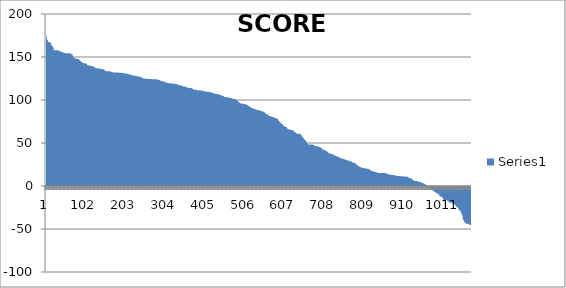
| Category | Series 0 |
|---|---|
| 0 | 175.5 |
| 1 | 175.4 |
| 2 | 170.6 |
| 3 | 170 |
| 4 | 169.9 |
| 5 | 167.9 |
| 6 | 167.7 |
| 7 | 167.4 |
| 8 | 167.2 |
| 9 | 167.2 |
| 10 | 167 |
| 11 | 166.6 |
| 12 | 166.4 |
| 13 | 166.1 |
| 14 | 164 |
| 15 | 162.6 |
| 16 | 162.6 |
| 17 | 162.5 |
| 18 | 162.1 |
| 19 | 160.8 |
| 20 | 157.8 |
| 21 | 157.8 |
| 22 | 157.8 |
| 23 | 157.8 |
| 24 | 157.8 |
| 25 | 157.8 |
| 26 | 157.8 |
| 27 | 157.8 |
| 28 | 157.8 |
| 29 | 157.8 |
| 30 | 157.8 |
| 31 | 157.8 |
| 32 | 157.8 |
| 33 | 157.7 |
| 34 | 156.8 |
| 35 | 156.8 |
| 36 | 156.8 |
| 37 | 156.6 |
| 38 | 155.9 |
| 39 | 155.9 |
| 40 | 155.9 |
| 41 | 155.7 |
| 42 | 155.7 |
| 43 | 155.3 |
| 44 | 155.1 |
| 45 | 154.8 |
| 46 | 154.6 |
| 47 | 154.6 |
| 48 | 154.6 |
| 49 | 154.4 |
| 50 | 154.4 |
| 51 | 154.4 |
| 52 | 154.3 |
| 53 | 154.3 |
| 54 | 154.3 |
| 55 | 154.3 |
| 56 | 154.3 |
| 57 | 154.3 |
| 58 | 154.3 |
| 59 | 154.3 |
| 60 | 154.3 |
| 61 | 154 |
| 62 | 154 |
| 63 | 153.8 |
| 64 | 153.3 |
| 65 | 153.3 |
| 66 | 153.1 |
| 67 | 152.8 |
| 68 | 151 |
| 69 | 150.4 |
| 70 | 149.1 |
| 71 | 149.1 |
| 72 | 149 |
| 73 | 148.7 |
| 74 | 148.4 |
| 75 | 148.4 |
| 76 | 148.3 |
| 77 | 147.9 |
| 78 | 147.8 |
| 79 | 147.8 |
| 80 | 147.8 |
| 81 | 147.7 |
| 82 | 147.7 |
| 83 | 147.5 |
| 84 | 147.1 |
| 85 | 145.8 |
| 86 | 145.8 |
| 87 | 145.8 |
| 88 | 144.9 |
| 89 | 144.6 |
| 90 | 144.6 |
| 91 | 144.1 |
| 92 | 143.9 |
| 93 | 143 |
| 94 | 142.7 |
| 95 | 142.7 |
| 96 | 142.7 |
| 97 | 142.7 |
| 98 | 142.7 |
| 99 | 142.7 |
| 100 | 142.6 |
| 101 | 142.5 |
| 102 | 142.4 |
| 103 | 142.1 |
| 104 | 141.8 |
| 105 | 140.4 |
| 106 | 140.2 |
| 107 | 140 |
| 108 | 140 |
| 109 | 140 |
| 110 | 140 |
| 111 | 140 |
| 112 | 140 |
| 113 | 139.9 |
| 114 | 139.6 |
| 115 | 139.4 |
| 116 | 139.4 |
| 117 | 139.4 |
| 118 | 139.3 |
| 119 | 139 |
| 120 | 138.9 |
| 121 | 138.6 |
| 122 | 138.6 |
| 123 | 138.2 |
| 124 | 137.8 |
| 125 | 137.6 |
| 126 | 136.8 |
| 127 | 136.8 |
| 128 | 136.8 |
| 129 | 136.8 |
| 130 | 136.8 |
| 131 | 136.8 |
| 132 | 136.8 |
| 133 | 136.8 |
| 134 | 136.7 |
| 135 | 136.7 |
| 136 | 136.7 |
| 137 | 136.5 |
| 138 | 136.2 |
| 139 | 136.2 |
| 140 | 136.1 |
| 141 | 136.1 |
| 142 | 135.9 |
| 143 | 135.9 |
| 144 | 135.9 |
| 145 | 135.9 |
| 146 | 135.6 |
| 147 | 135.5 |
| 148 | 134.9 |
| 149 | 134.3 |
| 150 | 133.6 |
| 151 | 133.6 |
| 152 | 133.6 |
| 153 | 133.6 |
| 154 | 133.5 |
| 155 | 133.5 |
| 156 | 133.5 |
| 157 | 133.5 |
| 158 | 133.5 |
| 159 | 133.5 |
| 160 | 133.5 |
| 161 | 133.3 |
| 162 | 133.3 |
| 163 | 133.1 |
| 164 | 132.8 |
| 165 | 132.7 |
| 166 | 132.6 |
| 167 | 132.3 |
| 168 | 132.3 |
| 169 | 132.2 |
| 170 | 132.2 |
| 171 | 132.1 |
| 172 | 132.1 |
| 173 | 132.1 |
| 174 | 132.1 |
| 175 | 132.1 |
| 176 | 132.1 |
| 177 | 132.1 |
| 178 | 132.1 |
| 179 | 132.1 |
| 180 | 132.1 |
| 181 | 132.1 |
| 182 | 132.1 |
| 183 | 132.1 |
| 184 | 131.8 |
| 185 | 131.6 |
| 186 | 131.6 |
| 187 | 131.6 |
| 188 | 131.6 |
| 189 | 131.6 |
| 190 | 131.6 |
| 191 | 131.6 |
| 192 | 131.6 |
| 193 | 131.5 |
| 194 | 131.5 |
| 195 | 131.5 |
| 196 | 131.4 |
| 197 | 131.1 |
| 198 | 131.1 |
| 199 | 131 |
| 200 | 130.9 |
| 201 | 130.8 |
| 202 | 130.8 |
| 203 | 130.8 |
| 204 | 130.8 |
| 205 | 130.5 |
| 206 | 130.5 |
| 207 | 130.3 |
| 208 | 130 |
| 209 | 130 |
| 210 | 130 |
| 211 | 130 |
| 212 | 129.8 |
| 213 | 129.8 |
| 214 | 129.2 |
| 215 | 129.1 |
| 216 | 129.1 |
| 217 | 129 |
| 218 | 128.8 |
| 219 | 128.8 |
| 220 | 128.5 |
| 221 | 128.5 |
| 222 | 128.4 |
| 223 | 128.3 |
| 224 | 128.3 |
| 225 | 128.3 |
| 226 | 128.3 |
| 227 | 127.8 |
| 228 | 127.8 |
| 229 | 127.8 |
| 230 | 127.5 |
| 231 | 127.5 |
| 232 | 127.4 |
| 233 | 127.2 |
| 234 | 127.2 |
| 235 | 127.2 |
| 236 | 127.2 |
| 237 | 127 |
| 238 | 126.8 |
| 239 | 126.7 |
| 240 | 126.7 |
| 241 | 126.4 |
| 242 | 126.1 |
| 243 | 126 |
| 244 | 125.5 |
| 245 | 125.4 |
| 246 | 125.2 |
| 247 | 125.1 |
| 248 | 125.1 |
| 249 | 125 |
| 250 | 124.9 |
| 251 | 124.8 |
| 252 | 124.8 |
| 253 | 124.8 |
| 254 | 124.8 |
| 255 | 124.7 |
| 256 | 124.7 |
| 257 | 124.6 |
| 258 | 124.4 |
| 259 | 124.4 |
| 260 | 124.4 |
| 261 | 124.4 |
| 262 | 124.4 |
| 263 | 124.4 |
| 264 | 124.3 |
| 265 | 124.3 |
| 266 | 124.3 |
| 267 | 124.2 |
| 268 | 124.1 |
| 269 | 124.1 |
| 270 | 124.1 |
| 271 | 124.1 |
| 272 | 124.1 |
| 273 | 124.1 |
| 274 | 124.1 |
| 275 | 124.1 |
| 276 | 124.1 |
| 277 | 124.1 |
| 278 | 124.1 |
| 279 | 124.1 |
| 280 | 124.1 |
| 281 | 124.1 |
| 282 | 123.9 |
| 283 | 123.7 |
| 284 | 123.5 |
| 285 | 123.5 |
| 286 | 123.4 |
| 287 | 123.2 |
| 288 | 123.1 |
| 289 | 122.7 |
| 290 | 122.4 |
| 291 | 122.1 |
| 292 | 122 |
| 293 | 121.9 |
| 294 | 121.9 |
| 295 | 121.9 |
| 296 | 121.6 |
| 297 | 121.4 |
| 298 | 121.4 |
| 299 | 121.4 |
| 300 | 121.3 |
| 301 | 121.2 |
| 302 | 120.6 |
| 303 | 120.6 |
| 304 | 120.4 |
| 305 | 120.3 |
| 306 | 120 |
| 307 | 119.9 |
| 308 | 119.8 |
| 309 | 119.7 |
| 310 | 119.6 |
| 311 | 119.6 |
| 312 | 119.5 |
| 313 | 119.3 |
| 314 | 119.3 |
| 315 | 119.3 |
| 316 | 119.3 |
| 317 | 119.3 |
| 318 | 119.2 |
| 319 | 119.1 |
| 320 | 119.1 |
| 321 | 119.1 |
| 322 | 119 |
| 323 | 118.9 |
| 324 | 118.8 |
| 325 | 118.8 |
| 326 | 118.7 |
| 327 | 118.5 |
| 328 | 118.5 |
| 329 | 118.5 |
| 330 | 118.5 |
| 331 | 118.4 |
| 332 | 118.4 |
| 333 | 117.9 |
| 334 | 117.9 |
| 335 | 117.7 |
| 336 | 117.5 |
| 337 | 117.1 |
| 338 | 117.1 |
| 339 | 117 |
| 340 | 117 |
| 341 | 116.9 |
| 342 | 116.9 |
| 343 | 116.7 |
| 344 | 116.7 |
| 345 | 116.2 |
| 346 | 116 |
| 347 | 115.8 |
| 348 | 115.8 |
| 349 | 115.6 |
| 350 | 115.6 |
| 351 | 115.6 |
| 352 | 115.5 |
| 353 | 115.4 |
| 354 | 115.4 |
| 355 | 114.9 |
| 356 | 114.8 |
| 357 | 114.6 |
| 358 | 114.3 |
| 359 | 114.2 |
| 360 | 114.2 |
| 361 | 114.1 |
| 362 | 114 |
| 363 | 113.9 |
| 364 | 113.9 |
| 365 | 113.9 |
| 366 | 113.9 |
| 367 | 113.9 |
| 368 | 113.7 |
| 369 | 113.5 |
| 370 | 113.4 |
| 371 | 113.1 |
| 372 | 112.6 |
| 373 | 112.2 |
| 374 | 112.2 |
| 375 | 112.1 |
| 376 | 112.1 |
| 377 | 112 |
| 378 | 111.9 |
| 379 | 111.9 |
| 380 | 111.8 |
| 381 | 111.8 |
| 382 | 111.4 |
| 383 | 111.4 |
| 384 | 111.4 |
| 385 | 111.4 |
| 386 | 111.4 |
| 387 | 111.3 |
| 388 | 111.2 |
| 389 | 111.2 |
| 390 | 111.2 |
| 391 | 111.1 |
| 392 | 111.1 |
| 393 | 111.1 |
| 394 | 111 |
| 395 | 110.9 |
| 396 | 110.7 |
| 397 | 110.7 |
| 398 | 110.4 |
| 399 | 110.3 |
| 400 | 110.3 |
| 401 | 110.3 |
| 402 | 110.2 |
| 403 | 110.2 |
| 404 | 110.1 |
| 405 | 109.9 |
| 406 | 109.7 |
| 407 | 109.7 |
| 408 | 109.7 |
| 409 | 109.5 |
| 410 | 109.4 |
| 411 | 109.3 |
| 412 | 109.2 |
| 413 | 109.2 |
| 414 | 109.2 |
| 415 | 109.1 |
| 416 | 109.1 |
| 417 | 109 |
| 418 | 108.8 |
| 419 | 108.6 |
| 420 | 108.6 |
| 421 | 108.3 |
| 422 | 108.2 |
| 423 | 108 |
| 424 | 107.9 |
| 425 | 107.8 |
| 426 | 107.8 |
| 427 | 107.6 |
| 428 | 107 |
| 429 | 107 |
| 430 | 107 |
| 431 | 107 |
| 432 | 107 |
| 433 | 107 |
| 434 | 106.8 |
| 435 | 106.7 |
| 436 | 106.6 |
| 437 | 106.4 |
| 438 | 106.4 |
| 439 | 106.2 |
| 440 | 106.1 |
| 441 | 105.8 |
| 442 | 105.6 |
| 443 | 105.6 |
| 444 | 105.5 |
| 445 | 105.4 |
| 446 | 105.4 |
| 447 | 104.8 |
| 448 | 104.5 |
| 449 | 104.4 |
| 450 | 104.4 |
| 451 | 104.1 |
| 452 | 103.5 |
| 453 | 103.3 |
| 454 | 103.3 |
| 455 | 103.3 |
| 456 | 103.3 |
| 457 | 103.3 |
| 458 | 103.2 |
| 459 | 103.1 |
| 460 | 103.1 |
| 461 | 103.1 |
| 462 | 102.8 |
| 463 | 102.6 |
| 464 | 102.6 |
| 465 | 102.6 |
| 466 | 102.5 |
| 467 | 102.5 |
| 468 | 102.2 |
| 469 | 102.2 |
| 470 | 101.9 |
| 471 | 101.9 |
| 472 | 101.5 |
| 473 | 101.3 |
| 474 | 101.3 |
| 475 | 101.2 |
| 476 | 101.1 |
| 477 | 101.1 |
| 478 | 100.9 |
| 479 | 100.9 |
| 480 | 100.8 |
| 481 | 100.4 |
| 482 | 99.7 |
| 483 | 99.6 |
| 484 | 99.4 |
| 485 | 99.2 |
| 486 | 98.6 |
| 487 | 97.5 |
| 488 | 97.5 |
| 489 | 97.3 |
| 490 | 96.7 |
| 491 | 96.3 |
| 492 | 96.2 |
| 493 | 95.9 |
| 494 | 95.9 |
| 495 | 95.9 |
| 496 | 95.9 |
| 497 | 95.8 |
| 498 | 95.5 |
| 499 | 95.5 |
| 500 | 95.3 |
| 501 | 95.3 |
| 502 | 95.3 |
| 503 | 95.2 |
| 504 | 95.1 |
| 505 | 95.1 |
| 506 | 94.8 |
| 507 | 94.7 |
| 508 | 94.4 |
| 509 | 94.1 |
| 510 | 94.1 |
| 511 | 93.7 |
| 512 | 93.4 |
| 513 | 92.6 |
| 514 | 92.6 |
| 515 | 92.6 |
| 516 | 92.6 |
| 517 | 92 |
| 518 | 91.9 |
| 519 | 91.1 |
| 520 | 90.7 |
| 521 | 90.6 |
| 522 | 90.5 |
| 523 | 90.4 |
| 524 | 89.9 |
| 525 | 89.8 |
| 526 | 89.5 |
| 527 | 89.5 |
| 528 | 89.5 |
| 529 | 89.5 |
| 530 | 89.3 |
| 531 | 89 |
| 532 | 88.7 |
| 533 | 88.6 |
| 534 | 88.3 |
| 535 | 88.3 |
| 536 | 88.3 |
| 537 | 88.1 |
| 538 | 88 |
| 539 | 88 |
| 540 | 88 |
| 541 | 87.7 |
| 542 | 87.6 |
| 543 | 87.5 |
| 544 | 87.3 |
| 545 | 87 |
| 546 | 87 |
| 547 | 86.9 |
| 548 | 86.8 |
| 549 | 86.6 |
| 550 | 86.6 |
| 551 | 86.3 |
| 552 | 85.9 |
| 553 | 85.6 |
| 554 | 85.4 |
| 555 | 84.5 |
| 556 | 84.3 |
| 557 | 83.8 |
| 558 | 83.5 |
| 559 | 83.4 |
| 560 | 83.2 |
| 561 | 83.2 |
| 562 | 83.1 |
| 563 | 82.6 |
| 564 | 81.7 |
| 565 | 81.3 |
| 566 | 81.3 |
| 567 | 81.2 |
| 568 | 81.1 |
| 569 | 81.1 |
| 570 | 81 |
| 571 | 80.5 |
| 572 | 80.5 |
| 573 | 80.4 |
| 574 | 80.2 |
| 575 | 80.2 |
| 576 | 80.2 |
| 577 | 79.5 |
| 578 | 79.5 |
| 579 | 79.2 |
| 580 | 79.1 |
| 581 | 79.1 |
| 582 | 78.8 |
| 583 | 78.7 |
| 584 | 78.7 |
| 585 | 78.6 |
| 586 | 78.3 |
| 587 | 77.8 |
| 588 | 76 |
| 589 | 75.6 |
| 590 | 75.1 |
| 591 | 74.9 |
| 592 | 74.5 |
| 593 | 74.2 |
| 594 | 74 |
| 595 | 72.5 |
| 596 | 72.5 |
| 597 | 72.3 |
| 598 | 72.3 |
| 599 | 72 |
| 600 | 70.5 |
| 601 | 70.1 |
| 602 | 70.1 |
| 603 | 69.6 |
| 604 | 69.6 |
| 605 | 68.8 |
| 606 | 68.8 |
| 607 | 68.8 |
| 608 | 68.6 |
| 609 | 68.5 |
| 610 | 67.5 |
| 611 | 66.8 |
| 612 | 66.2 |
| 613 | 66 |
| 614 | 65.9 |
| 615 | 65.8 |
| 616 | 65.8 |
| 617 | 65.6 |
| 618 | 65.6 |
| 619 | 65.1 |
| 620 | 65.1 |
| 621 | 65.1 |
| 622 | 65.1 |
| 623 | 65.1 |
| 624 | 64.9 |
| 625 | 64.9 |
| 626 | 64.2 |
| 627 | 63.3 |
| 628 | 63.2 |
| 629 | 63 |
| 630 | 62.6 |
| 631 | 62.6 |
| 632 | 61.9 |
| 633 | 61.5 |
| 634 | 60.9 |
| 635 | 60.9 |
| 636 | 60.8 |
| 637 | 60.8 |
| 638 | 60.8 |
| 639 | 60.8 |
| 640 | 60.8 |
| 641 | 60.8 |
| 642 | 60.8 |
| 643 | 60.7 |
| 644 | 60.1 |
| 645 | 59.7 |
| 646 | 59.2 |
| 647 | 59.1 |
| 648 | 57.6 |
| 649 | 57.1 |
| 650 | 56.7 |
| 651 | 56.2 |
| 652 | 55.3 |
| 653 | 55 |
| 654 | 53.7 |
| 655 | 53.7 |
| 656 | 53.6 |
| 657 | 52.7 |
| 658 | 51.9 |
| 659 | 51.9 |
| 660 | 50.8 |
| 661 | 49.8 |
| 662 | 49.3 |
| 663 | 48.8 |
| 664 | 48.3 |
| 665 | 48.3 |
| 666 | 48.3 |
| 667 | 48.3 |
| 668 | 48.3 |
| 669 | 48.3 |
| 670 | 48.3 |
| 671 | 48.3 |
| 672 | 48.3 |
| 673 | 48.3 |
| 674 | 48.3 |
| 675 | 48.3 |
| 676 | 47.9 |
| 677 | 47.7 |
| 678 | 47.6 |
| 679 | 47.3 |
| 680 | 46.6 |
| 681 | 46.5 |
| 682 | 46.5 |
| 683 | 46.3 |
| 684 | 46.3 |
| 685 | 46.2 |
| 686 | 46.2 |
| 687 | 46.1 |
| 688 | 45.7 |
| 689 | 45.7 |
| 690 | 45.7 |
| 691 | 45.5 |
| 692 | 45.5 |
| 693 | 45.2 |
| 694 | 44.7 |
| 695 | 44.6 |
| 696 | 44.5 |
| 697 | 44.4 |
| 698 | 44.4 |
| 699 | 42.7 |
| 700 | 42.3 |
| 701 | 42.3 |
| 702 | 42.1 |
| 703 | 42.1 |
| 704 | 41.8 |
| 705 | 41.7 |
| 706 | 41.6 |
| 707 | 41.5 |
| 708 | 41 |
| 709 | 40.5 |
| 710 | 40.4 |
| 711 | 40.1 |
| 712 | 39.8 |
| 713 | 39.5 |
| 714 | 39.3 |
| 715 | 38.3 |
| 716 | 38.2 |
| 717 | 38.1 |
| 718 | 37.8 |
| 719 | 37.8 |
| 720 | 37.5 |
| 721 | 37.3 |
| 722 | 37.3 |
| 723 | 37.2 |
| 724 | 36.9 |
| 725 | 36.9 |
| 726 | 36.8 |
| 727 | 36.4 |
| 728 | 36.4 |
| 729 | 36.2 |
| 730 | 35.8 |
| 731 | 35.3 |
| 732 | 35.3 |
| 733 | 35.3 |
| 734 | 34.8 |
| 735 | 34.7 |
| 736 | 34.3 |
| 737 | 34.3 |
| 738 | 34.2 |
| 739 | 34.1 |
| 740 | 34.1 |
| 741 | 33.8 |
| 742 | 33.7 |
| 743 | 32.8 |
| 744 | 32.8 |
| 745 | 32.7 |
| 746 | 32.2 |
| 747 | 32.2 |
| 748 | 31.7 |
| 749 | 31.6 |
| 750 | 31.6 |
| 751 | 31.6 |
| 752 | 31.6 |
| 753 | 31.6 |
| 754 | 31.5 |
| 755 | 31 |
| 756 | 31 |
| 757 | 30.7 |
| 758 | 30.7 |
| 759 | 30.5 |
| 760 | 30.2 |
| 761 | 30.2 |
| 762 | 30 |
| 763 | 29.7 |
| 764 | 29.7 |
| 765 | 29.6 |
| 766 | 29.4 |
| 767 | 29.1 |
| 768 | 29.1 |
| 769 | 29.1 |
| 770 | 29.1 |
| 771 | 28.5 |
| 772 | 28.5 |
| 773 | 28.4 |
| 774 | 28.2 |
| 775 | 27.3 |
| 776 | 27.3 |
| 777 | 27.3 |
| 778 | 27 |
| 779 | 26.9 |
| 780 | 26.9 |
| 781 | 26.8 |
| 782 | 26.8 |
| 783 | 26 |
| 784 | 25.9 |
| 785 | 25.4 |
| 786 | 24.9 |
| 787 | 24.3 |
| 788 | 24.3 |
| 789 | 23.8 |
| 790 | 23 |
| 791 | 23 |
| 792 | 22.8 |
| 793 | 22.8 |
| 794 | 22.5 |
| 795 | 22.1 |
| 796 | 22 |
| 797 | 21.6 |
| 798 | 21.3 |
| 799 | 21.3 |
| 800 | 21.2 |
| 801 | 21.1 |
| 802 | 21 |
| 803 | 21 |
| 804 | 20.8 |
| 805 | 20.7 |
| 806 | 20.6 |
| 807 | 20.5 |
| 808 | 20.4 |
| 809 | 20.3 |
| 810 | 20.3 |
| 811 | 20.3 |
| 812 | 20.3 |
| 813 | 20.2 |
| 814 | 20.2 |
| 815 | 20.2 |
| 816 | 20.2 |
| 817 | 19.7 |
| 818 | 19.7 |
| 819 | 18.8 |
| 820 | 18.3 |
| 821 | 18.3 |
| 822 | 18 |
| 823 | 17.9 |
| 824 | 17.6 |
| 825 | 17.2 |
| 826 | 17.2 |
| 827 | 17.2 |
| 828 | 17.1 |
| 829 | 17.1 |
| 830 | 16.9 |
| 831 | 16.5 |
| 832 | 16.4 |
| 833 | 16.4 |
| 834 | 16.2 |
| 835 | 16.1 |
| 836 | 16.1 |
| 837 | 16 |
| 838 | 15.8 |
| 839 | 15.4 |
| 840 | 15.3 |
| 841 | 15.2 |
| 842 | 15.2 |
| 843 | 15.2 |
| 844 | 15.2 |
| 845 | 15.2 |
| 846 | 15.2 |
| 847 | 15.2 |
| 848 | 15.2 |
| 849 | 15.2 |
| 850 | 15.2 |
| 851 | 15.2 |
| 852 | 15.2 |
| 853 | 15.2 |
| 854 | 15.2 |
| 855 | 15.2 |
| 856 | 15.2 |
| 857 | 15.2 |
| 858 | 15.2 |
| 859 | 15.2 |
| 860 | 14.9 |
| 861 | 14.9 |
| 862 | 14.6 |
| 863 | 14.6 |
| 864 | 14.6 |
| 865 | 13.8 |
| 866 | 13.5 |
| 867 | 13.5 |
| 868 | 13.4 |
| 869 | 13.3 |
| 870 | 13.3 |
| 871 | 13.3 |
| 872 | 13.2 |
| 873 | 13 |
| 874 | 12.9 |
| 875 | 12.9 |
| 876 | 12.9 |
| 877 | 12.9 |
| 878 | 12.9 |
| 879 | 12.9 |
| 880 | 12.7 |
| 881 | 12.7 |
| 882 | 12.7 |
| 883 | 12.3 |
| 884 | 12.3 |
| 885 | 12.2 |
| 886 | 12 |
| 887 | 11.6 |
| 888 | 11.5 |
| 889 | 11.5 |
| 890 | 11.5 |
| 891 | 11.5 |
| 892 | 11.5 |
| 893 | 11.5 |
| 894 | 11.5 |
| 895 | 11.5 |
| 896 | 11.5 |
| 897 | 11.4 |
| 898 | 11.3 |
| 899 | 11.3 |
| 900 | 11.3 |
| 901 | 11.3 |
| 902 | 11.3 |
| 903 | 11.3 |
| 904 | 11.2 |
| 905 | 11.1 |
| 906 | 11 |
| 907 | 11 |
| 908 | 11 |
| 909 | 11 |
| 910 | 11 |
| 911 | 11 |
| 912 | 10.9 |
| 913 | 10.9 |
| 914 | 10.8 |
| 915 | 10.8 |
| 916 | 10.5 |
| 917 | 10.1 |
| 918 | 9.5 |
| 919 | 9.2 |
| 920 | 9 |
| 921 | 8.9 |
| 922 | 8.9 |
| 923 | 8.9 |
| 924 | 8.9 |
| 925 | 8.5 |
| 926 | 8.1 |
| 927 | 7.6 |
| 928 | 7.2 |
| 929 | 6.7 |
| 930 | 6.4 |
| 931 | 6.2 |
| 932 | 6 |
| 933 | 6 |
| 934 | 5.9 |
| 935 | 5.9 |
| 936 | 5.9 |
| 937 | 5.8 |
| 938 | 5.7 |
| 939 | 5.7 |
| 940 | 5.6 |
| 941 | 5.3 |
| 942 | 5.2 |
| 943 | 5.1 |
| 944 | 5 |
| 945 | 4.9 |
| 946 | 4.9 |
| 947 | 4.8 |
| 948 | 4.5 |
| 949 | 4.2 |
| 950 | 4.2 |
| 951 | 3.9 |
| 952 | 3.8 |
| 953 | 3.5 |
| 954 | 3.3 |
| 955 | 2.9 |
| 956 | 2.9 |
| 957 | 2.9 |
| 958 | 2.6 |
| 959 | 2.1 |
| 960 | 1.7 |
| 961 | 1.3 |
| 962 | 1.2 |
| 963 | 0.6 |
| 964 | 0.3 |
| 965 | -1.8 |
| 966 | -2.3 |
| 967 | -2.4 |
| 968 | -2.5 |
| 969 | -2.8 |
| 970 | -2.8 |
| 971 | -3.2 |
| 972 | -3.2 |
| 973 | -3.5 |
| 974 | -3.8 |
| 975 | -3.8 |
| 976 | -4.3 |
| 977 | -4.5 |
| 978 | -4.9 |
| 979 | -5.3 |
| 980 | -5.4 |
| 981 | -5.9 |
| 982 | -6.4 |
| 983 | -6.7 |
| 984 | -7.1 |
| 985 | -7.1 |
| 986 | -7.5 |
| 987 | -7.7 |
| 988 | -8.4 |
| 989 | -8.7 |
| 990 | -8.8 |
| 991 | -8.8 |
| 992 | -9.3 |
| 993 | -9.4 |
| 994 | -9.9 |
| 995 | -10.3 |
| 996 | -11.8 |
| 997 | -11.8 |
| 998 | -12.2 |
| 999 | -12.4 |
| 1000 | -12.5 |
| 1001 | -12.6 |
| 1002 | -12.6 |
| 1003 | -12.7 |
| 1004 | -14.7 |
| 1005 | -15.9 |
| 1006 | -16 |
| 1007 | -16.1 |
| 1008 | -16.1 |
| 1009 | -16.2 |
| 1010 | -16.2 |
| 1011 | -16.2 |
| 1012 | -16.5 |
| 1013 | -16.6 |
| 1014 | -16.9 |
| 1015 | -16.9 |
| 1016 | -17 |
| 1017 | -17.3 |
| 1018 | -17.6 |
| 1019 | -18.4 |
| 1020 | -18.9 |
| 1021 | -19.5 |
| 1022 | -19.5 |
| 1023 | -19.5 |
| 1024 | -19.5 |
| 1025 | -19.5 |
| 1026 | -19.5 |
| 1027 | -19.6 |
| 1028 | -19.8 |
| 1029 | -20.7 |
| 1030 | -20.8 |
| 1031 | -21.2 |
| 1032 | -21.2 |
| 1033 | -21.2 |
| 1034 | -21.2 |
| 1035 | -21.8 |
| 1036 | -22.4 |
| 1037 | -22.7 |
| 1038 | -23.3 |
| 1039 | -24.6 |
| 1040 | -24.8 |
| 1041 | -25 |
| 1042 | -25 |
| 1043 | -25.2 |
| 1044 | -26.9 |
| 1045 | -27.1 |
| 1046 | -28.6 |
| 1047 | -28.9 |
| 1048 | -28.9 |
| 1049 | -29.4 |
| 1050 | -30 |
| 1051 | -31.9 |
| 1052 | -32.9 |
| 1053 | -33 |
| 1054 | -36 |
| 1055 | -38.5 |
| 1056 | -39.5 |
| 1057 | -40.1 |
| 1058 | -40.5 |
| 1059 | -41.8 |
| 1060 | -42.8 |
| 1061 | -42.8 |
| 1062 | -43.3 |
| 1063 | -43.9 |
| 1064 | -43.9 |
| 1065 | -43.9 |
| 1066 | -43.9 |
| 1067 | -43.9 |
| 1068 | -43.9 |
| 1069 | -44.1 |
| 1070 | -44.5 |
| 1071 | -44.7 |
| 1072 | -45.1 |
| 1073 | -45.2 |
| 1074 | -45.3 |
| 1075 | -46 |
| 1076 | -46 |
| 1077 | -46 |
| 1078 | -46.1 |